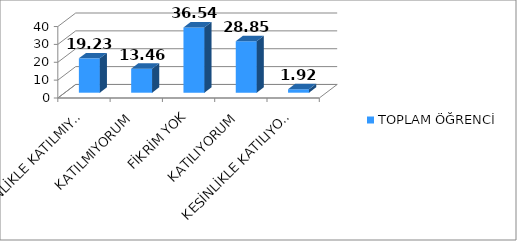
| Category | TOPLAM ÖĞRENCİ |
|---|---|
| KESİNLİKLE KATILMIYORUM | 19.23 |
| KATILMIYORUM | 13.46 |
| FİKRİM YOK | 36.54 |
| KATILIYORUM | 28.85 |
| KESİNLİKLE KATILIYORUM | 1.92 |